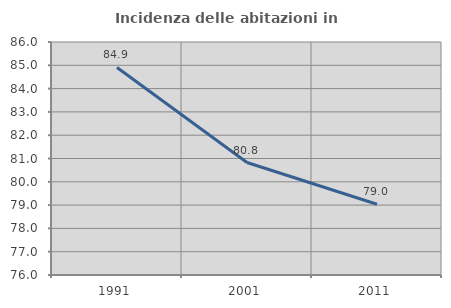
| Category | Incidenza delle abitazioni in proprietà  |
|---|---|
| 1991.0 | 84.906 |
| 2001.0 | 80.827 |
| 2011.0 | 79.038 |